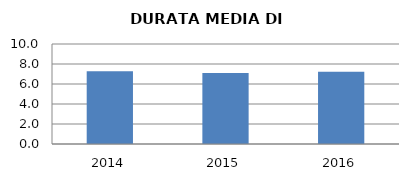
| Category | 2014 2015 2016 |
|---|---|
| 2014.0 | 7.263 |
| 2015.0 | 7.105 |
| 2016.0 | 7.216 |